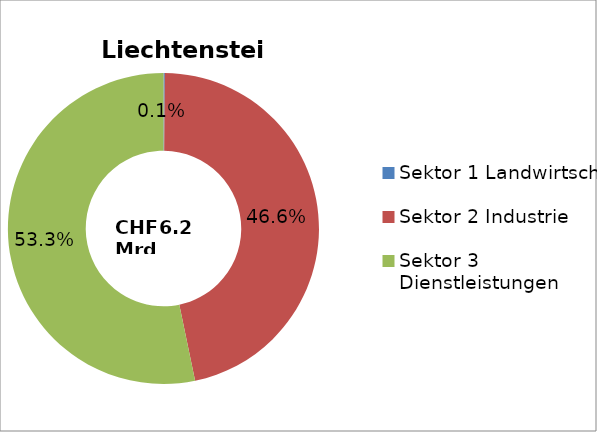
| Category | Liechtenstein |
|---|---|
| Sektor 1 Landwirtschaft | 0.001 |
| Sektor 2 Industrie | 0.466 |
| Sektor 3 Dienstleistungen | 0.533 |